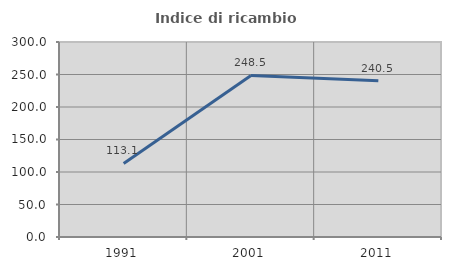
| Category | Indice di ricambio occupazionale  |
|---|---|
| 1991.0 | 113.115 |
| 2001.0 | 248.529 |
| 2011.0 | 240.541 |